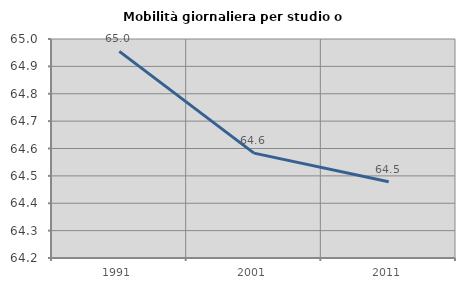
| Category | Mobilità giornaliera per studio o lavoro |
|---|---|
| 1991.0 | 64.955 |
| 2001.0 | 64.583 |
| 2011.0 | 64.479 |